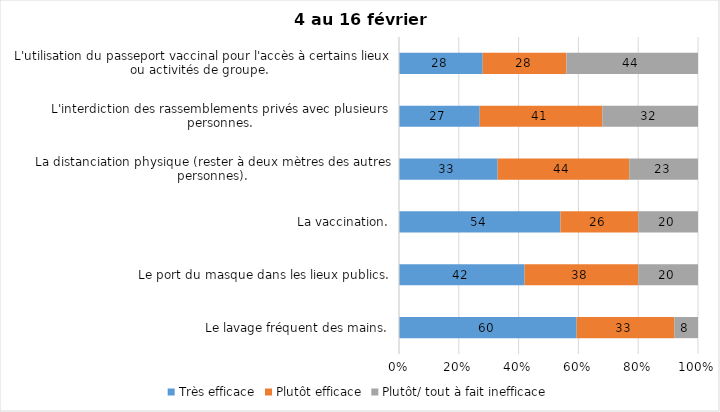
| Category | Très efficace | Plutôt efficace | Plutôt/ tout à fait inefficace |
|---|---|---|---|
| Le lavage fréquent des mains. | 60 | 33 | 8 |
| Le port du masque dans les lieux publics. | 42 | 38 | 20 |
| La vaccination. | 54 | 26 | 20 |
| La distanciation physique (rester à deux mètres des autres personnes). | 33 | 44 | 23 |
| L'interdiction des rassemblements privés avec plusieurs personnes. | 27 | 41 | 32 |
| L'utilisation du passeport vaccinal pour l'accès à certains lieux ou activités de groupe.  | 28 | 28 | 44 |